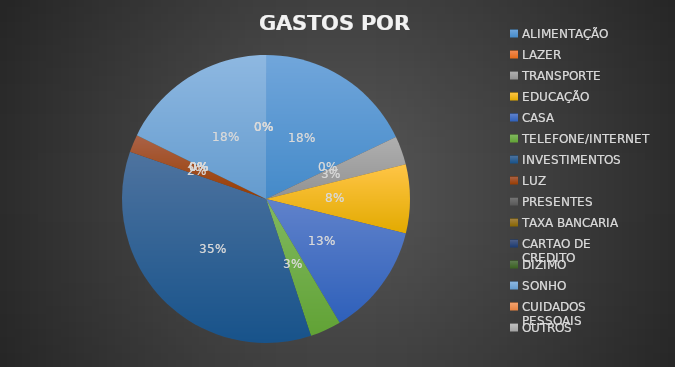
| Category | Series 0 |
|---|---|
| ALIMENTAÇÃO | 810 |
| LAZER | 0 |
| TRANSPORTE | 145 |
| EDUCAÇÃO | 350 |
| CASA | 570 |
| TELEFONE/INTERNET | 158 |
| INVESTIMENTOS | 1600 |
| LUZ | 90 |
| PRESENTES | 0 |
| TAXA BANCARIA | 0 |
| CARTAO DE CREDITO | 0 |
| DIZIMO | 0 |
| SONHO | 800 |
| CUIDADOS PESSOAIS | 0 |
| OUTROS | 0 |